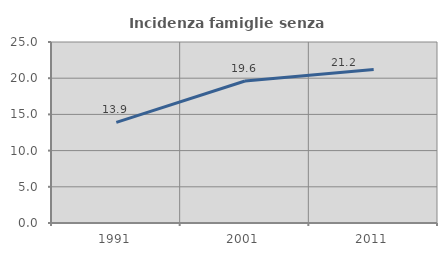
| Category | Incidenza famiglie senza nuclei |
|---|---|
| 1991.0 | 13.907 |
| 2001.0 | 19.615 |
| 2011.0 | 21.217 |